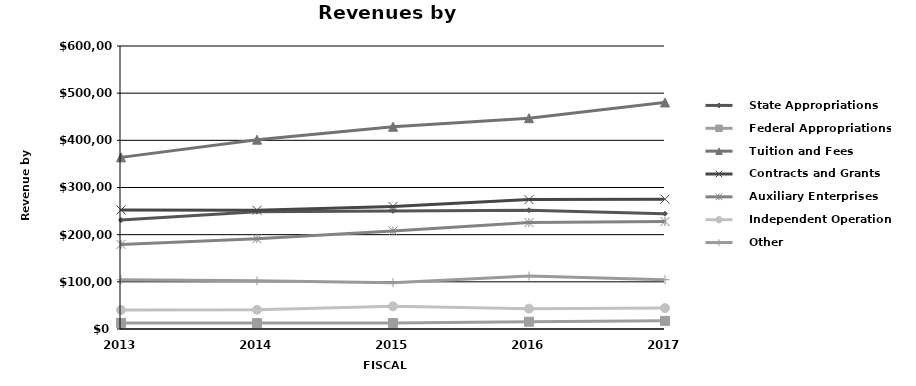
| Category |    State Appropriations |    Federal Appropriations |    Tuition and Fees |    Contracts and Grants |    Auxiliary Enterprises |    Independent Operations |    Other |
|---|---|---|---|---|---|---|---|
| 0 | 231002 | 12886 | 363870 | 252410 | 179371 | 40299 | 104342 |
| 1 | 248633 | 12541 | 401418 | 251681 | 191304 | 40659 | 102103 |
| 2 | 250354 | 12730 | 428932 | 259827 | 207932 | 48100 | 98268 |
| 3 | 251782 | 15367 | 446954 | 274325 | 225621 | 43048 | 112234 |
| 4 | 244458 | 17255 | 480293 | 275261 | 227892 | 44315 | 104559 |